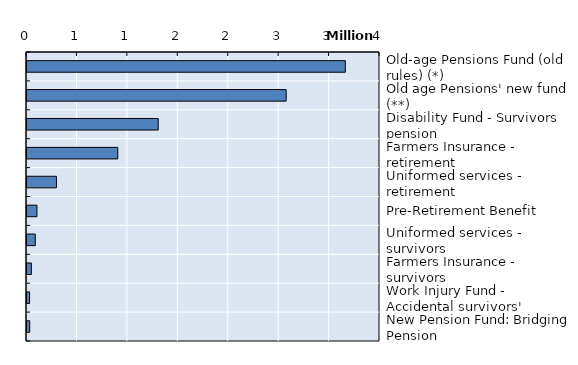
| Category | Series 0 |
|---|---|
| Old-age Pensions Fund (old rules) (*) | 3156152 |
| Old age Pensions' new fund (**) | 2569922 |
| Disability Fund - Survivors pension | 1301033 |
| Farmers Insurance - retirement | 900045 |
| Uniformed services - retirement | 292031 |
| Pre-Retirement Benefit | 98787 |
| Uniformed services - survivors | 82108 |
| Farmers Insurance - survivors | 43200 |
| Work Injury Fund - Accidental survivors' pension | 25569 |
| New Pension Fund: Bridging Pension | 26777 |